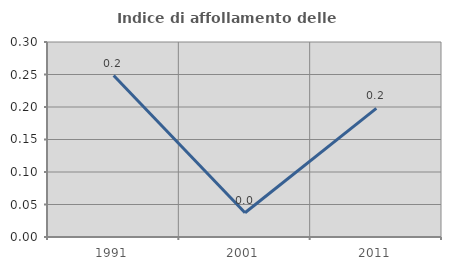
| Category | Indice di affollamento delle abitazioni  |
|---|---|
| 1991.0 | 0.248 |
| 2001.0 | 0.037 |
| 2011.0 | 0.198 |